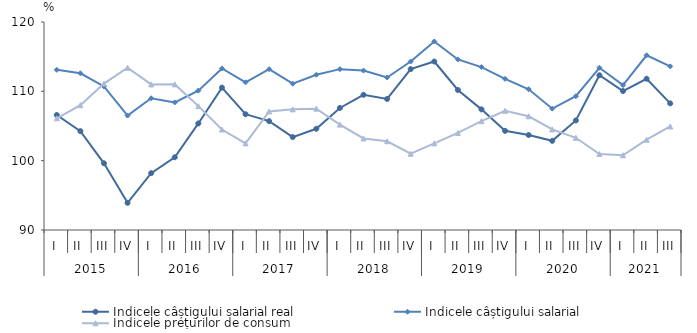
| Category | Indicele câștigului salarial real | Indicele câștigului salarial | Indicele prețurilor de consum |
|---|---|---|---|
| 0 | 106.588 | 113.1 | 106.11 |
| 1 | 104.259 | 112.6 | 108 |
| 2 | 99.622 | 110.7 | 111.12 |
| 3 | 93.915 | 106.5 | 113.4 |
| 4 | 98.2 | 109 | 111 |
| 5 | 100.491 | 108.4 | 111.01 |
| 6 | 105.369 | 110.1 | 107.87 |
| 7 | 110.537 | 113.3 | 104.49 |
| 8 | 106.7 | 111.3 | 102.5 |
| 9 | 105.7 | 113.2 | 107.1 |
| 10 | 103.4 | 111.1 | 107.4 |
| 11 | 104.6 | 112.4 | 107.5 |
| 12 | 107.6 | 113.2 | 105.2 |
| 13 | 109.5 | 113 | 103.2 |
| 14 | 108.9 | 112 | 102.8 |
| 15 | 113.2 | 114.3 | 101 |
| 16 | 114.3 | 117.2 | 102.5 |
| 17 | 110.2 | 114.6 | 104 |
| 18 | 107.4 | 113.5 | 105.7 |
| 19 | 104.3 | 111.8 | 107.2 |
| 20 | 103.7 | 110.3 | 106.4 |
| 21 | 102.861 | 107.5 | 104.51 |
| 22 | 105.8 | 109.3 | 103.3 |
| 23 | 112.322 | 113.4 | 100.96 |
| 24 | 110.042 | 110.9 | 100.78 |
| 25 | 111.816 | 115.2 | 103.026 |
| 26 | 108.263 | 113.6 | 104.93 |